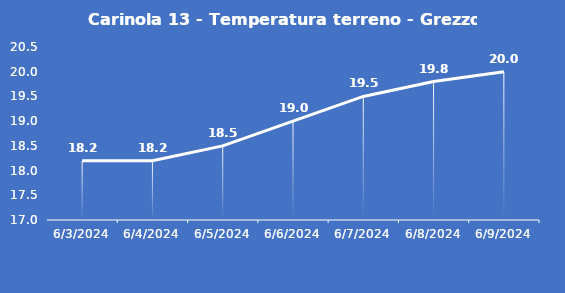
| Category | Carinola 13 - Temperatura terreno - Grezzo (°C) |
|---|---|
| 6/3/24 | 18.2 |
| 6/4/24 | 18.2 |
| 6/5/24 | 18.5 |
| 6/6/24 | 19 |
| 6/7/24 | 19.5 |
| 6/8/24 | 19.8 |
| 6/9/24 | 20 |